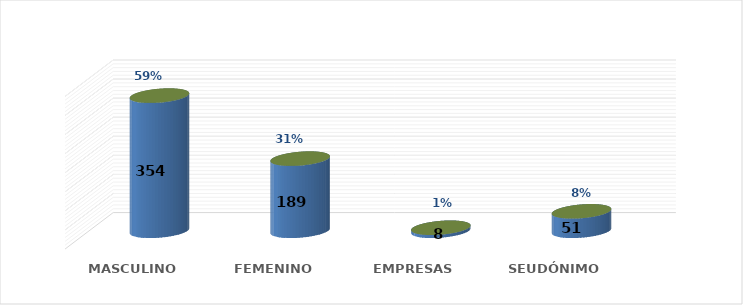
| Category | SOLICITUD POR GÉNERO | Series 1 |
|---|---|---|
| MASCULINO | 354 | 0.588 |
| FEMENINO | 189 | 0.314 |
| EMPRESAS | 8 | 0.013 |
| SEUDÓNIMO | 51 | 0.085 |